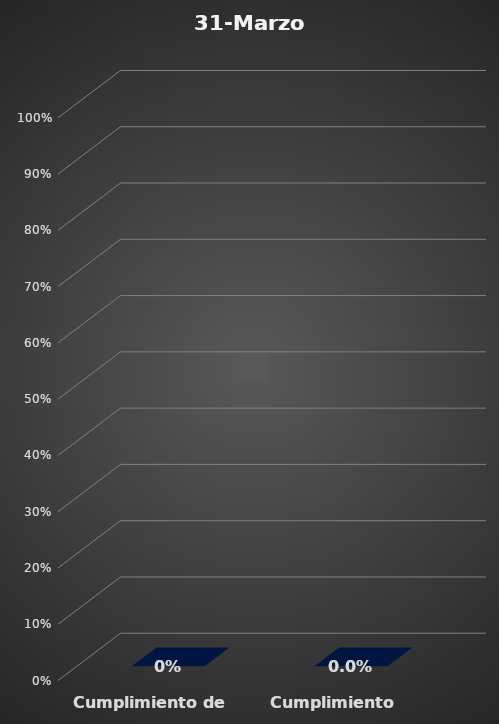
| Category | 31-mar.-18 |
|---|---|
| Cumplimiento de Hitos | 0 |
| Cumplimiento Temporal | 0 |